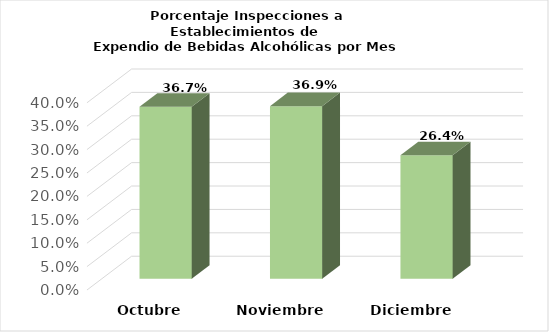
| Category | Series 0 |
|---|---|
| Octubre | 0.367 |
| Noviembre | 0.369 |
| Diciembre | 0.264 |